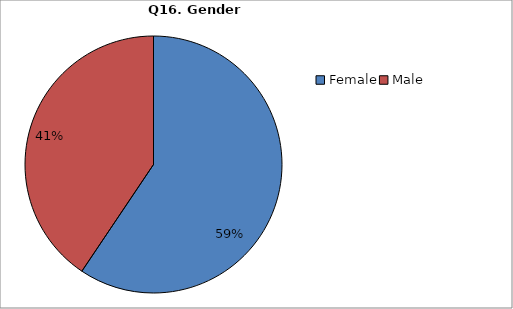
| Category | Series 0 |
|---|---|
| Female | 262 |
| Male | 179 |